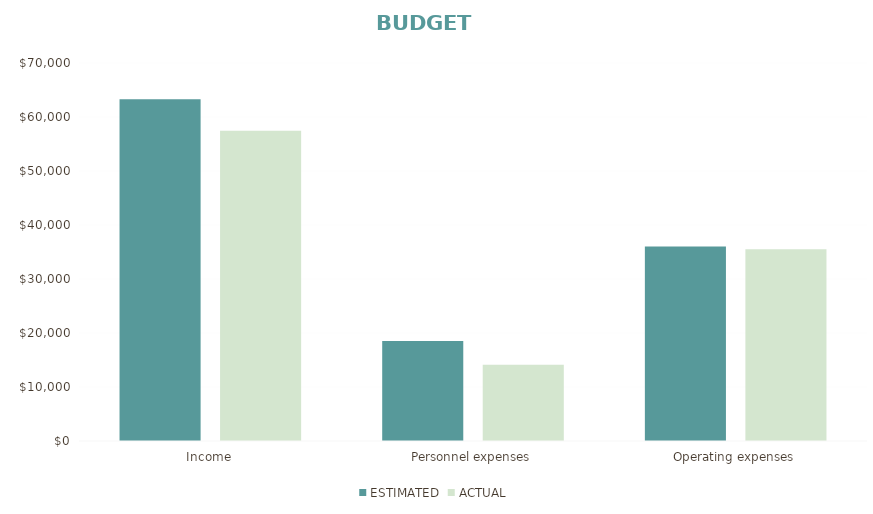
| Category | ESTIMATED | ACTUAL |
|---|---|---|
| Income | 63300 | 57450 |
| Personnel expenses | 18500 | 14100 |
| Operating expenses | 36000 | 35530 |